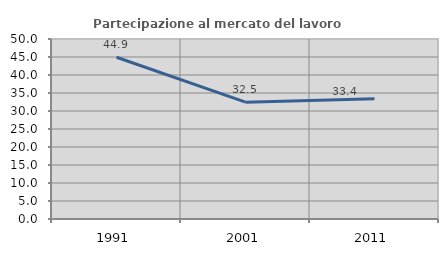
| Category | Partecipazione al mercato del lavoro  femminile |
|---|---|
| 1991.0 | 44.932 |
| 2001.0 | 32.462 |
| 2011.0 | 33.418 |